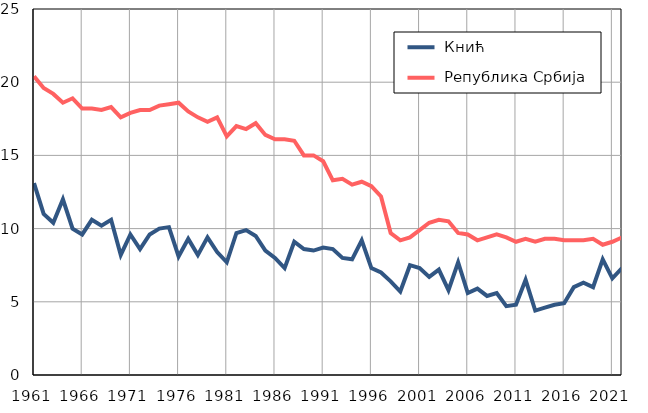
| Category |  Кнић |  Република Србија |
|---|---|---|
| 1961.0 | 13.1 | 20.4 |
| 1962.0 | 11 | 19.6 |
| 1963.0 | 10.4 | 19.2 |
| 1964.0 | 12 | 18.6 |
| 1965.0 | 10 | 18.9 |
| 1966.0 | 9.6 | 18.2 |
| 1967.0 | 10.6 | 18.2 |
| 1968.0 | 10.2 | 18.1 |
| 1969.0 | 10.6 | 18.3 |
| 1970.0 | 8.2 | 17.6 |
| 1971.0 | 9.6 | 17.9 |
| 1972.0 | 8.6 | 18.1 |
| 1973.0 | 9.6 | 18.1 |
| 1974.0 | 10 | 18.4 |
| 1975.0 | 10.1 | 18.5 |
| 1976.0 | 8.1 | 18.6 |
| 1977.0 | 9.3 | 18 |
| 1978.0 | 8.2 | 17.6 |
| 1979.0 | 9.4 | 17.3 |
| 1980.0 | 8.4 | 17.6 |
| 1981.0 | 7.7 | 16.3 |
| 1982.0 | 9.7 | 17 |
| 1983.0 | 9.9 | 16.8 |
| 1984.0 | 9.5 | 17.2 |
| 1985.0 | 8.5 | 16.4 |
| 1986.0 | 8 | 16.1 |
| 1987.0 | 7.3 | 16.1 |
| 1988.0 | 9.1 | 16 |
| 1989.0 | 8.6 | 15 |
| 1990.0 | 8.5 | 15 |
| 1991.0 | 8.7 | 14.6 |
| 1992.0 | 8.6 | 13.3 |
| 1993.0 | 8 | 13.4 |
| 1994.0 | 7.9 | 13 |
| 1995.0 | 9.2 | 13.2 |
| 1996.0 | 7.3 | 12.9 |
| 1997.0 | 7 | 12.2 |
| 1998.0 | 6.4 | 9.7 |
| 1999.0 | 5.7 | 9.2 |
| 2000.0 | 7.5 | 9.4 |
| 2001.0 | 7.3 | 9.9 |
| 2002.0 | 6.7 | 10.4 |
| 2003.0 | 7.2 | 10.6 |
| 2004.0 | 5.8 | 10.5 |
| 2005.0 | 7.7 | 9.7 |
| 2006.0 | 5.6 | 9.6 |
| 2007.0 | 5.9 | 9.2 |
| 2008.0 | 5.4 | 9.4 |
| 2009.0 | 5.6 | 9.6 |
| 2010.0 | 4.7 | 9.4 |
| 2011.0 | 4.8 | 9.1 |
| 2012.0 | 6.5 | 9.3 |
| 2013.0 | 4.4 | 9.1 |
| 2014.0 | 4.6 | 9.3 |
| 2015.0 | 4.8 | 9.3 |
| 2016.0 | 4.9 | 9.2 |
| 2017.0 | 6 | 9.2 |
| 2018.0 | 6.3 | 9.2 |
| 2019.0 | 6 | 9.3 |
| 2020.0 | 7.9 | 8.9 |
| 2021.0 | 6.6 | 9.1 |
| 2022.0 | 7.3 | 9.4 |